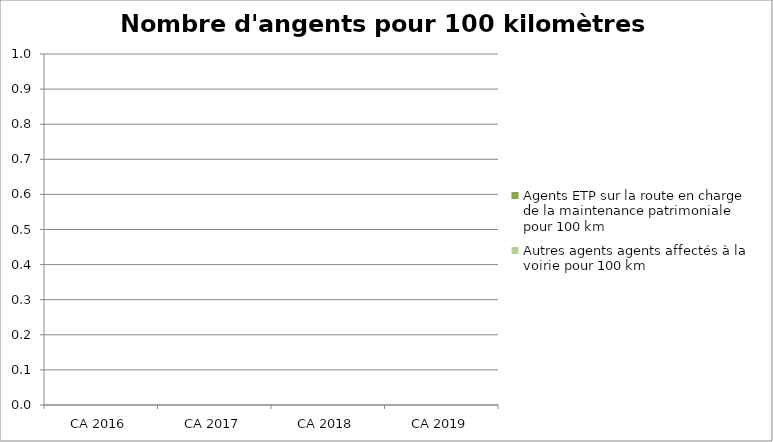
| Category | Agents ETP sur la route en charge de la maintenance patrimoniale pour 100 km | Autres agents agents affectés à la voirie pour 100 km |
|---|---|---|
| CA 2016 | 0 | 0 |
| CA 2017 | 0 | 0 |
| CA 2018 | 0 | 0 |
| CA 2019 | 0 | 0 |